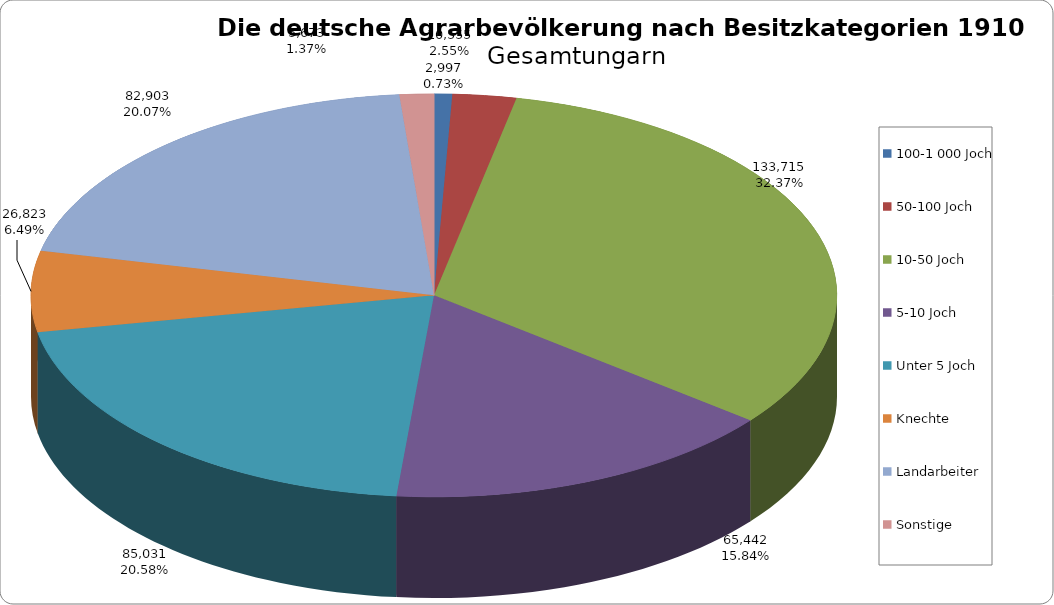
| Category | Series 0 |
|---|---|
| 100-1 000 Joch | 2997 |
| 50-100 Joch | 10555 |
| 10-50 Joch | 133715 |
| 5-10 Joch | 65442 |
| Unter 5 Joch | 85031 |
| Knechte | 26823 |
| Landarbeiter | 82903 |
| Sonstige | 5673 |